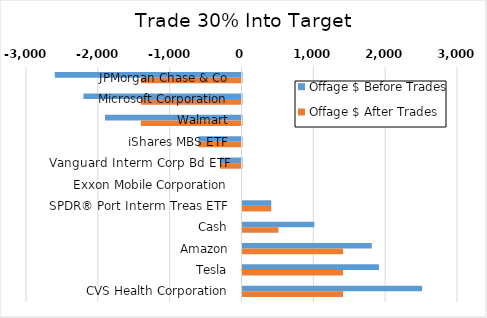
| Category | Offage $ Before Trades | Offage $ After Trades |
|---|---|---|
| JPMorgan Chase & Co | -2600 | -1400 |
| Microsoft Corporation | -2200 | -1400 |
| Walmart | -1900 | -1400 |
| iShares MBS ETF | -600 | -600 |
| Vanguard Interm Corp Bd ETF | -300 | -300 |
| Exxon Mobile Corporation | 0 | 0 |
| SPDR® Port Interm Treas ETF | 400 | 400 |
| Cash | 1000 | 500 |
| Amazon | 1800 | 1400 |
| Tesla | 1900 | 1400 |
| CVS Health Corporation | 2500 | 1400 |